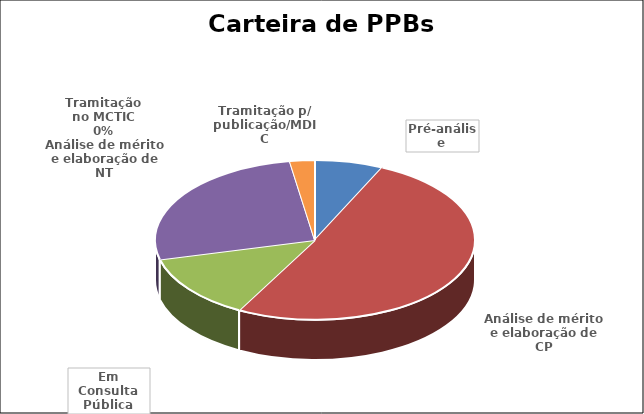
| Category | Series 0 |
|---|---|
| Pré-análise | 11 |
| Análise de mérito e elaboração de CP | 81 |
| Em Consulta Pública | 21 |
| Análise de mérito e elaboração de NT | 42 |
| Tramitação no MCTIC | 0 |
| Tramitação p/ publicação/MDIC | 4 |